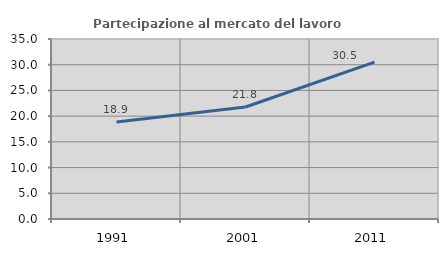
| Category | Partecipazione al mercato del lavoro  femminile |
|---|---|
| 1991.0 | 18.864 |
| 2001.0 | 21.781 |
| 2011.0 | 30.493 |